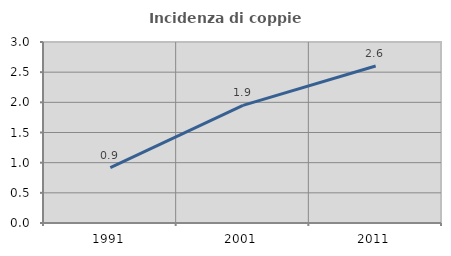
| Category | Incidenza di coppie miste |
|---|---|
| 1991.0 | 0.919 |
| 2001.0 | 1.949 |
| 2011.0 | 2.602 |